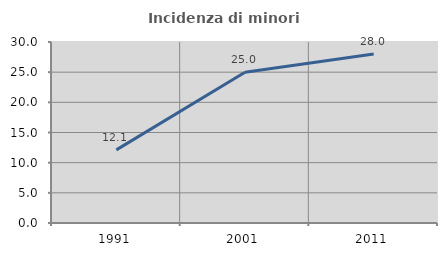
| Category | Incidenza di minori stranieri |
|---|---|
| 1991.0 | 12.121 |
| 2001.0 | 25 |
| 2011.0 | 28.014 |